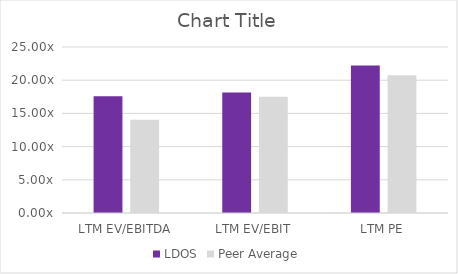
| Category | LDOS | Peer Average |
|---|---|---|
| LTM EV/EBITDA | 17.581 | 14.052 |
| LTM EV/EBIT | 18.162 | 17.515 |
| LTM PE | 22.222 | 20.756 |